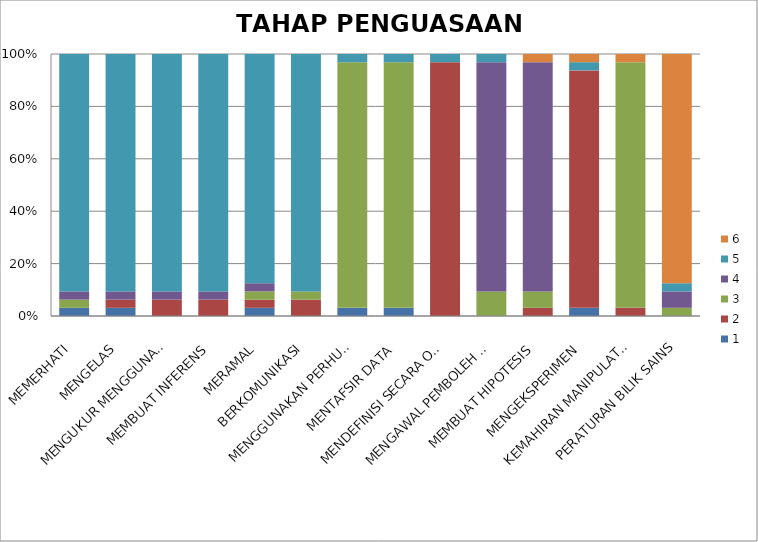
| Category | 1 | 2 | 3 | 4 | 5 | 6 |
|---|---|---|---|---|---|---|
| MEMERHATI | 1 | 0 | 1 | 1 | 29 | 0 |
| MENGELAS | 1 | 1 | 0 | 1 | 29 | 0 |
| MENGUKUR MENGGUNAKAN NOMBOR | 0 | 2 | 0 | 1 | 29 | 0 |
| MEMBUAT INFERENS | 0 | 2 | 0 | 1 | 29 | 0 |
| MERAMAL | 1 | 1 | 1 | 1 | 28 | 0 |
| BERKOMUNIKASI | 0 | 2 | 1 | 0 | 29 | 0 |
| MENGGUNAKAN PERHUBUNGAN RUANG DAN MASA | 1 | 0 | 30 | 0 | 1 | 0 |
| MENTAFSIR DATA | 1 | 0 | 30 | 0 | 1 | 0 |
| MENDEFINISI SECARA OPERASI | 0 | 31 | 0 | 0 | 1 | 0 |
| MENGAWAL PEMBOLEH UBAH | 0 | 0 | 3 | 28 | 1 | 0 |
| MEMBUAT HIPOTESIS | 0 | 1 | 2 | 28 | 0 | 1 |
| MENGEKSPERIMEN | 1 | 29 | 0 | 0 | 1 | 1 |
| KEMAHIRAN MANIPULATIF | 0 | 1 | 30 | 0 | 0 | 1 |
| PERATURAN BILIK SAINS | 0 | 0 | 1 | 2 | 1 | 28 |